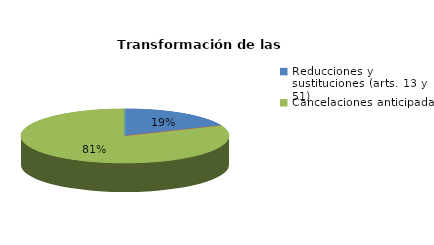
| Category | Series 0 |
|---|---|
| Reducciones y sustituciones (arts. 13 y 51) | 15 |
| Por quebrantamiento (art. 50.2) | 0 |
| Cancelaciones anticipadas | 65 |
| Traslado a Centros Penitenciarios | 0 |
| Conversión internamientos en cerrados (art. 51.2) | 0 |